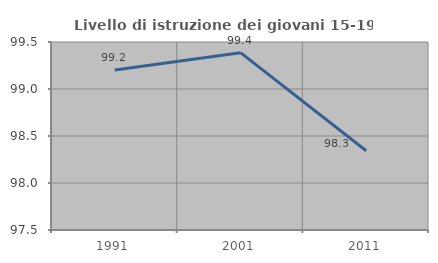
| Category | Livello di istruzione dei giovani 15-19 anni |
|---|---|
| 1991.0 | 99.203 |
| 2001.0 | 99.387 |
| 2011.0 | 98.343 |